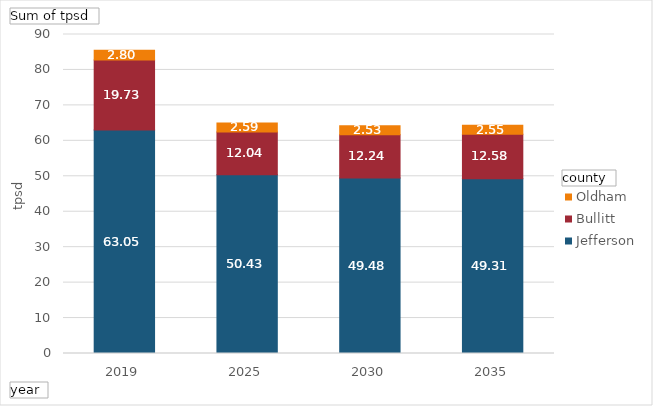
| Category | Jefferson | Bullitt | Oldham |
|---|---|---|---|
| 2019 | 63.054 | 19.732 | 2.801 |
| 2025 | 50.426 | 12.044 | 2.586 |
| 2030 | 49.48 | 12.241 | 2.535 |
| 2035 | 49.306 | 12.575 | 2.549 |